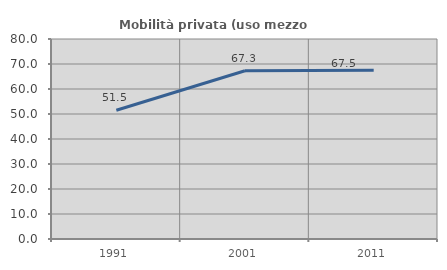
| Category | Mobilità privata (uso mezzo privato) |
|---|---|
| 1991.0 | 51.496 |
| 2001.0 | 67.282 |
| 2011.0 | 67.541 |